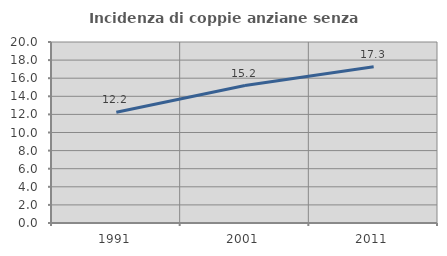
| Category | Incidenza di coppie anziane senza figli  |
|---|---|
| 1991.0 | 12.231 |
| 2001.0 | 15.188 |
| 2011.0 | 17.268 |